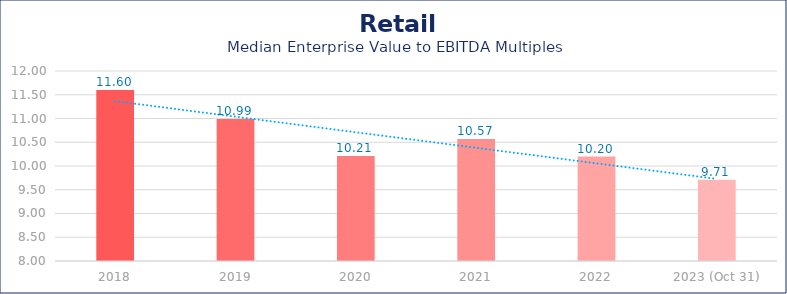
| Category | Retail |
|---|---|
| 2018 | 11.6 |
| 2019 | 10.99 |
| 2020 | 10.21 |
| 2021 | 10.57 |
| 2022 | 10.2 |
| 2023 (Oct 31) | 9.71 |